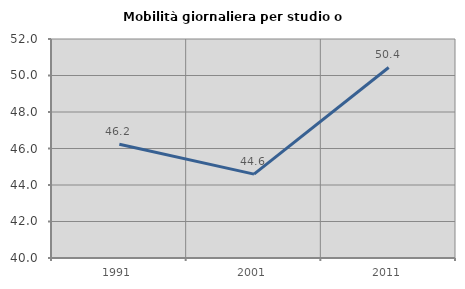
| Category | Mobilità giornaliera per studio o lavoro |
|---|---|
| 1991.0 | 46.234 |
| 2001.0 | 44.596 |
| 2011.0 | 50.441 |